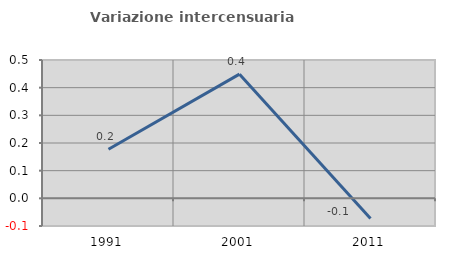
| Category | Variazione intercensuaria annua |
|---|---|
| 1991.0 | 0.177 |
| 2001.0 | 0.449 |
| 2011.0 | -0.073 |